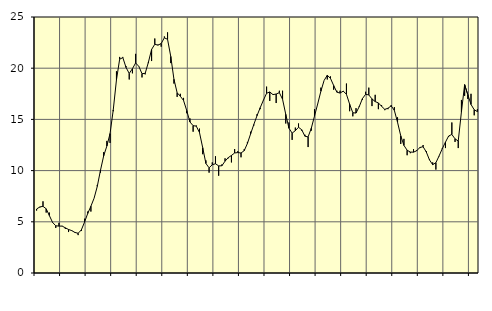
| Category | Piggar | Series 1 |
|---|---|---|
| nan | 6.1 | 6.25 |
| 87.0 | 6.4 | 6.45 |
| 87.0 | 7 | 6.51 |
| 87.0 | 5.9 | 6.27 |
| nan | 5.9 | 5.61 |
| 88.0 | 4.9 | 4.94 |
| 88.0 | 4.4 | 4.61 |
| 88.0 | 4.9 | 4.58 |
| nan | 4.6 | 4.58 |
| 89.0 | 4.3 | 4.41 |
| 89.0 | 4 | 4.25 |
| 89.0 | 4.1 | 4.14 |
| nan | 4 | 3.96 |
| 90.0 | 3.7 | 3.88 |
| 90.0 | 4.1 | 4.2 |
| 90.0 | 5.3 | 4.96 |
| nan | 6 | 5.81 |
| 91.0 | 6 | 6.52 |
| 91.0 | 7.3 | 7.3 |
| 91.0 | 8.6 | 8.46 |
| nan | 9.8 | 10.03 |
| 92.0 | 11.8 | 11.44 |
| 92.0 | 12.9 | 12.4 |
| 92.0 | 12.7 | 13.62 |
| nan | 15.8 | 15.93 |
| 93.0 | 19.7 | 18.86 |
| 93.0 | 21.1 | 20.88 |
| 93.0 | 21.1 | 21.03 |
| nan | 20.2 | 20.07 |
| 94.0 | 18.9 | 19.49 |
| 94.0 | 19.5 | 19.95 |
| 94.0 | 21.4 | 20.51 |
| nan | 20.2 | 20.18 |
| 95.0 | 19.1 | 19.46 |
| 95.0 | 19.4 | 19.5 |
| 95.0 | 20.5 | 20.58 |
| nan | 20.7 | 21.83 |
| 96.0 | 22.9 | 22.34 |
| 96.0 | 22.3 | 22.25 |
| 96.0 | 22.1 | 22.41 |
| nan | 23.1 | 22.97 |
| 97.0 | 23.5 | 22.82 |
| 97.0 | 20.5 | 21.15 |
| 97.0 | 18.5 | 18.92 |
| nan | 17.2 | 17.6 |
| 98.0 | 17.5 | 17.26 |
| 98.0 | 17.1 | 16.85 |
| 98.0 | 15.6 | 15.87 |
| nan | 15.1 | 14.75 |
| 99.0 | 13.8 | 14.39 |
| 99.0 | 14.4 | 14.34 |
| 99.0 | 14.1 | 13.71 |
| nan | 11.6 | 12.24 |
| 0.0 | 11 | 10.7 |
| 0.0 | 9.8 | 10.27 |
| 0.0 | 10.8 | 10.57 |
| nan | 11.4 | 10.67 |
| 1.0 | 9.5 | 10.46 |
| 1.0 | 10.6 | 10.47 |
| 1.0 | 11.2 | 10.92 |
| nan | 11.2 | 11.27 |
| 2.0 | 10.8 | 11.48 |
| 2.0 | 12.1 | 11.72 |
| 2.0 | 11.9 | 11.76 |
| nan | 11.3 | 11.72 |
| 3.0 | 12.1 | 11.95 |
| 3.0 | 12.8 | 12.65 |
| 3.0 | 13.8 | 13.59 |
| nan | 14.4 | 14.5 |
| 4.0 | 15.5 | 15.36 |
| 4.0 | 16 | 16.14 |
| 4.0 | 16.9 | 16.87 |
| nan | 18.2 | 17.55 |
| 5.0 | 16.8 | 17.68 |
| 5.0 | 17.4 | 17.42 |
| 5.0 | 16.6 | 17.48 |
| nan | 17.8 | 17.61 |
| 6.0 | 17.8 | 16.97 |
| 6.0 | 14.6 | 15.5 |
| 6.0 | 14.7 | 14.14 |
| nan | 13 | 13.66 |
| 7.0 | 14.2 | 13.9 |
| 7.0 | 14.6 | 14.23 |
| 7.0 | 13.9 | 13.99 |
| nan | 13.5 | 13.36 |
| 8.0 | 12.3 | 13.29 |
| 8.0 | 13.9 | 14.14 |
| 8.0 | 16 | 15.32 |
| nan | 16.5 | 16.51 |
| 9.0 | 18.1 | 17.75 |
| 9.0 | 18.8 | 18.8 |
| 9.0 | 18.9 | 19.31 |
| nan | 19.2 | 19.01 |
| 10.0 | 17.9 | 18.31 |
| 10.0 | 17.8 | 17.66 |
| 10.0 | 17.8 | 17.57 |
| nan | 17.7 | 17.76 |
| 11.0 | 18.5 | 17.45 |
| 11.0 | 15.8 | 16.49 |
| 11.0 | 15.3 | 15.65 |
| nan | 16.1 | 15.62 |
| 12.0 | 16.3 | 16.24 |
| 12.0 | 16.9 | 17.03 |
| 12.0 | 17.7 | 17.45 |
| nan | 18.1 | 17.39 |
| 13.0 | 16.3 | 17 |
| 13.0 | 17.4 | 16.74 |
| 13.0 | 16 | 16.61 |
| nan | 16.4 | 16.28 |
| 14.0 | 15.9 | 15.98 |
| 14.0 | 16 | 16.09 |
| 14.0 | 16.4 | 16.32 |
| nan | 16.2 | 15.88 |
| 15.0 | 15.2 | 14.72 |
| 15.0 | 12.6 | 13.4 |
| 15.0 | 13.1 | 12.46 |
| nan | 11.5 | 11.99 |
| 16.0 | 11.7 | 11.81 |
| 16.0 | 12.1 | 11.8 |
| 16.0 | 12 | 11.94 |
| nan | 12.2 | 12.26 |
| 17.0 | 12.5 | 12.33 |
| 17.0 | 11.9 | 11.82 |
| 17.0 | 11.1 | 11.04 |
| nan | 10.8 | 10.58 |
| 18.0 | 10.1 | 10.77 |
| 18.0 | 11.4 | 11.43 |
| 18.0 | 12.2 | 12.14 |
| nan | 12.2 | 12.78 |
| 19.0 | 13.3 | 13.38 |
| 19.0 | 14.7 | 13.53 |
| 19.0 | 12.8 | 13.1 |
| nan | 12.2 | 12.89 |
| 20.0 | 16.9 | 15.74 |
| 20.0 | 17.3 | 18.39 |
| 20.0 | 17 | 17.41 |
| nan | 17.5 | 16.46 |
| 21.0 | 15.4 | 15.94 |
| 21.0 | 16 | 15.76 |